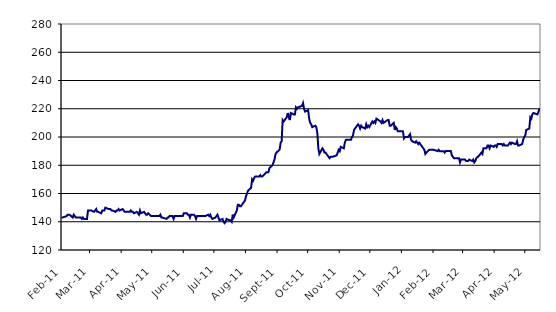
| Category | Series 0 |
|---|---|
| 2011-02-17 | 143 |
| 2011-02-18 | 143 |
| 2011-02-22 | 144 |
| 2011-02-23 | 145 |
| 2011-02-24 | 145 |
| 2011-02-25 | 145 |
| 2011-02-28 | 143 |
| 2011-03-01 | 145 |
| 2011-03-02 | 144 |
| 2011-03-03 | 143 |
| 2011-03-04 | 143 |
| 2011-03-07 | 143 |
| 2011-03-08 | 143 |
| 2011-03-09 | 142 |
| 2011-03-10 | 143 |
| 2011-03-11 | 142 |
| 2011-03-14 | 142 |
| 2011-03-15 | 148 |
| 2011-03-16 | 148 |
| 2011-03-17 | 148 |
| 2011-03-18 | 148 |
| 2011-03-21 | 147 |
| 2011-03-22 | 148 |
| 2011-03-23 | 149 |
| 2011-03-24 | 147 |
| 2011-03-25 | 147 |
| 2011-03-28 | 146 |
| 2011-03-29 | 148 |
| 2011-03-30 | 148 |
| 2011-03-31 | 148 |
| 2011-04-01 | 150 |
| 2011-04-04 | 149 |
| 2011-04-05 | 149 |
| 2011-04-06 | 149 |
| 2011-04-07 | 148 |
| 2011-04-08 | 148 |
| 2011-04-11 | 147 |
| 2011-04-12 | 148 |
| 2011-04-13 | 148 |
| 2011-04-14 | 149 |
| 2011-04-15 | 148 |
| 2011-04-18 | 149 |
| 2011-04-19 | 148 |
| 2011-04-20 | 147 |
| 2011-04-21 | 147 |
| 2011-04-25 | 147 |
| 2011-04-26 | 148 |
| 2011-04-27 | 147 |
| 2011-04-28 | 147 |
| 2011-04-29 | 146 |
| 2011-05-02 | 147 |
| 2011-05-03 | 146 |
| 2011-05-04 | 145 |
| 2011-05-05 | 148 |
| 2011-05-06 | 146 |
| 2011-05-09 | 147 |
| 2011-05-10 | 146 |
| 2011-05-11 | 145 |
| 2011-05-12 | 145 |
| 2011-05-13 | 146 |
| 2011-05-16 | 144 |
| 2011-05-17 | 144 |
| 2011-05-18 | 144 |
| 2011-05-19 | 144 |
| 2011-05-20 | 144 |
| 2011-05-23 | 144 |
| 2011-05-24 | 144 |
| 2011-05-25 | 145 |
| 2011-05-26 | 143 |
| 2011-05-27 | 143 |
| 2011-05-31 | 142 |
| 2011-06-01 | 143 |
| 2011-06-02 | 143 |
| 2011-06-03 | 144 |
| 2011-06-06 | 144 |
| 2011-06-07 | 142 |
| 2011-06-08 | 144 |
| 2011-06-09 | 144 |
| 2011-06-10 | 144 |
| 2011-06-13 | 144 |
| 2011-06-14 | 144 |
| 2011-06-15 | 144 |
| 2011-06-16 | 144 |
| 2011-06-17 | 146 |
| 2011-06-20 | 146 |
| 2011-06-21 | 145 |
| 2011-06-22 | 145 |
| 2011-06-23 | 143 |
| 2011-06-24 | 145 |
| 2011-06-27 | 145 |
| 2011-06-28 | 144 |
| 2011-06-29 | 142 |
| 2011-06-30 | 144 |
| 2011-07-01 | 144 |
| 2011-07-05 | 144 |
| 2011-07-06 | 144 |
| 2011-07-07 | 144 |
| 2011-07-08 | 144 |
| 2011-07-11 | 145 |
| 2011-07-12 | 144 |
| 2011-07-13 | 145 |
| 2011-07-14 | 143 |
| 2011-07-15 | 142 |
| 2011-07-18 | 143 |
| 2011-07-19 | 144 |
| 2011-07-20 | 145 |
| 2011-07-21 | 143 |
| 2011-07-22 | 141 |
| 2011-07-25 | 142 |
| 2011-07-26 | 140 |
| 2011-07-27 | 139 |
| 2011-07-28 | 140 |
| 2011-07-29 | 142 |
| 2011-08-01 | 141 |
| 2011-08-02 | 141 |
| 2011-08-03 | 140 |
| 2011-08-04 | 145 |
| 2011-08-05 | 143 |
| 2011-08-08 | 148 |
| 2011-08-09 | 152 |
| 2011-08-10 | 152 |
| 2011-08-11 | 151 |
| 2011-08-12 | 151 |
| 2011-08-15 | 154 |
| 2011-08-16 | 155 |
| 2011-08-17 | 158 |
| 2011-08-18 | 160 |
| 2011-08-19 | 162 |
| 2011-08-22 | 164 |
| 2011-08-23 | 170 |
| 2011-08-24 | 169 |
| 2011-08-25 | 171 |
| 2011-08-26 | 172 |
| 2011-08-29 | 172 |
| 2011-08-30 | 172 |
| 2011-08-31 | 173 |
| 2011-09-01 | 172 |
| 2011-09-02 | 172 |
| 2011-09-06 | 175 |
| 2011-09-07 | 175 |
| 2011-09-08 | 175 |
| 2011-09-09 | 178 |
| 2011-09-12 | 180 |
| 2011-09-13 | 182 |
| 2011-09-14 | 184 |
| 2011-09-15 | 188 |
| 2011-09-16 | 189 |
| 2011-09-19 | 191 |
| 2011-09-20 | 196 |
| 2011-09-21 | 197 |
| 2011-09-22 | 212 |
| 2011-09-23 | 211 |
| 2011-09-26 | 214 |
| 2011-09-27 | 217 |
| 2011-09-28 | 214 |
| 2011-09-29 | 212 |
| 2011-09-30 | 217 |
| 2011-10-03 | 216 |
| 2011-10-04 | 216 |
| 2011-10-05 | 221 |
| 2011-10-06 | 220 |
| 2011-10-07 | 221 |
| 2011-10-11 | 222 |
| 2011-10-12 | 224 |
| 2011-10-13 | 220 |
| 2011-10-14 | 218 |
| 2011-10-17 | 219 |
| 2011-10-18 | 213 |
| 2011-10-19 | 210 |
| 2011-10-20 | 209 |
| 2011-10-21 | 207 |
| 2011-10-24 | 208 |
| 2011-10-25 | 207 |
| 2011-10-26 | 203 |
| 2011-10-27 | 192 |
| 2011-10-28 | 188 |
| 2011-10-31 | 192 |
| 2011-11-01 | 191 |
| 2011-11-02 | 189 |
| 2011-11-03 | 189 |
| 2011-11-04 | 188 |
| 2011-11-07 | 185 |
| 2011-11-08 | 186 |
| 2011-11-09 | 186 |
| 2011-11-10 | 186 |
| 2011-11-14 | 187 |
| 2011-11-15 | 189 |
| 2011-11-16 | 191 |
| 2011-11-17 | 190 |
| 2011-11-18 | 193 |
| 2011-11-21 | 192 |
| 2011-11-22 | 196 |
| 2011-11-23 | 198 |
| 2011-11-25 | 198 |
| 2011-11-28 | 198 |
| 2011-11-29 | 200 |
| 2011-11-30 | 201 |
| 2011-12-01 | 205 |
| 2011-12-02 | 206 |
| 2011-12-05 | 209 |
| 2011-12-06 | 208 |
| 2011-12-07 | 206 |
| 2011-12-08 | 208 |
| 2011-12-09 | 207 |
| 2011-12-12 | 206 |
| 2011-12-13 | 209 |
| 2011-12-14 | 207 |
| 2011-12-15 | 208 |
| 2011-12-16 | 207 |
| 2011-12-19 | 211 |
| 2011-12-20 | 210 |
| 2011-12-21 | 211 |
| 2011-12-22 | 210 |
| 2011-12-23 | 213 |
| 2011-12-27 | 211 |
| 2011-12-28 | 210 |
| 2011-12-29 | 212 |
| 2011-12-30 | 210 |
| 2012-01-03 | 212 |
| 2012-01-04 | 212 |
| 2012-01-05 | 208 |
| 2012-01-06 | 208 |
| 2012-01-09 | 210 |
| 2012-01-10 | 205 |
| 2012-01-11 | 207 |
| 2012-01-12 | 206 |
| 2012-01-13 | 204 |
| 2012-01-17 | 204 |
| 2012-01-18 | 204 |
| 2012-01-19 | 199 |
| 2012-01-20 | 200 |
| 2012-01-23 | 200 |
| 2012-01-24 | 201 |
| 2012-01-25 | 202 |
| 2012-01-26 | 198 |
| 2012-01-27 | 197 |
| 2012-01-30 | 196 |
| 2012-01-31 | 197 |
| 2012-02-01 | 196 |
| 2012-02-02 | 195 |
| 2012-02-03 | 196 |
| 2012-02-06 | 193 |
| 2012-02-07 | 192 |
| 2012-02-08 | 191 |
| 2012-02-09 | 188 |
| 2012-02-10 | 189 |
| 2012-02-13 | 191 |
| 2012-02-14 | 191 |
| 2012-02-15 | 191 |
| 2012-02-16 | 191 |
| 2012-02-17 | 191 |
| 2012-02-21 | 190 |
| 2012-02-22 | 191 |
| 2012-02-23 | 190 |
| 2012-02-24 | 190 |
| 2012-02-27 | 190 |
| 2012-02-28 | 189 |
| 2012-02-29 | 190 |
| 2012-03-01 | 190 |
| 2012-03-02 | 190 |
| 2012-03-05 | 190 |
| 2012-03-06 | 187 |
| 2012-03-07 | 186 |
| 2012-03-08 | 185 |
| 2012-03-09 | 185 |
| 2012-03-12 | 185 |
| 2012-03-13 | 185 |
| 2012-03-14 | 182 |
| 2012-03-15 | 184 |
| 2012-03-16 | 184 |
| 2012-03-19 | 184 |
| 2012-03-20 | 183 |
| 2012-03-21 | 183 |
| 2012-03-22 | 183 |
| 2012-03-23 | 184 |
| 2012-03-26 | 183 |
| 2012-03-27 | 184 |
| 2012-03-28 | 182 |
| 2012-03-29 | 183 |
| 2012-03-30 | 185 |
| 2012-04-02 | 187 |
| 2012-04-03 | 188 |
| 2012-04-04 | 189 |
| 2012-04-05 | 188 |
| 2012-04-06 | 192 |
| 2012-04-09 | 192 |
| 2012-04-10 | 194 |
| 2012-04-11 | 194 |
| 2012-04-12 | 192 |
| 2012-04-13 | 194 |
| 2012-04-16 | 193 |
| 2012-04-17 | 194 |
| 2012-04-18 | 194 |
| 2012-04-19 | 193 |
| 2012-04-20 | 195 |
| 2012-04-23 | 195 |
| 2012-04-24 | 195 |
| 2012-04-25 | 194 |
| 2012-04-26 | 195 |
| 2012-04-27 | 194 |
| 2012-04-30 | 194 |
| 2012-05-01 | 195 |
| 2012-05-02 | 196 |
| 2012-05-03 | 195 |
| 2012-05-04 | 196 |
| 2012-05-07 | 195 |
| 2012-05-08 | 195 |
| 2012-05-09 | 197 |
| 2012-05-10 | 194 |
| 2012-05-11 | 194 |
| 2012-05-14 | 195 |
| 2012-05-15 | 198 |
| 2012-05-16 | 200 |
| 2012-05-17 | 201 |
| 2012-05-18 | 205 |
| 2012-05-21 | 206 |
| 2012-05-22 | 214 |
| 2012-05-23 | 213 |
| 2012-05-24 | 216 |
| 2012-05-25 | 217 |
| 2012-05-29 | 216 |
| 2012-05-30 | 218 |
| 2012-05-31 | 220 |